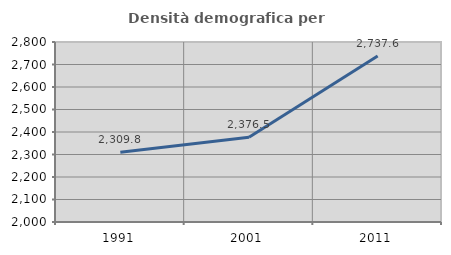
| Category | Densità demografica |
|---|---|
| 1991.0 | 2309.83 |
| 2001.0 | 2376.512 |
| 2011.0 | 2737.573 |